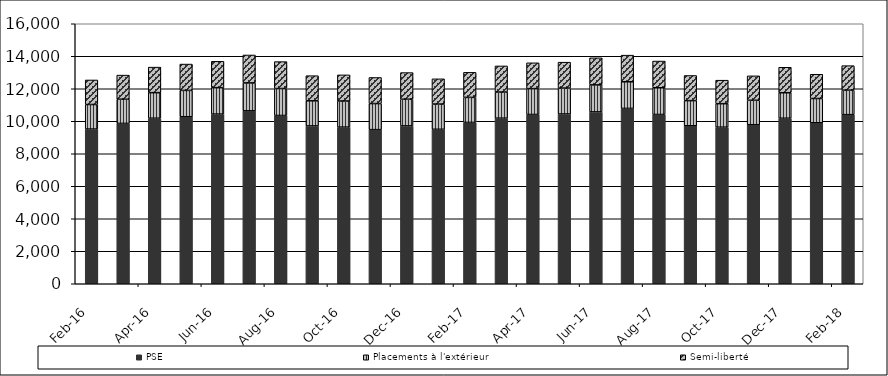
| Category | PSE | Placements à l'extérieur | Semi-liberté |
|---|---|---|---|
| 2016-02-01 | 9521 | 1510 | 1510 |
| 2016-03-01 | 9868 | 1486 | 1486 |
| 2016-04-01 | 10187 | 1572 | 1572 |
| 2016-05-01 | 10278 | 1621 | 1621 |
| 2016-06-01 | 10441 | 1625 | 1625 |
| 2016-07-01 | 10642 | 1718 | 1718 |
| 2016-08-01 | 10355 | 1658 | 1658 |
| 2016-09-01 | 9712 | 1546 | 1546 |
| 2016-10-01 | 9640 | 1607 | 1607 |
| 2016-11-01 | 9484 | 1605 | 1605 |
| 2016-12-01 | 9714 | 1641 | 1641 |
| 2017-01-01 | 9505 | 1553 | 1553 |
| 2017-02-01 | 9927 | 1542 | 1542 |
| 2017-03-01 | 10190 | 1607 | 1607 |
| 2017-04-01 | 10417 | 1590 | 1590 |
| 2017-05-01 | 10448 | 1594 | 1594 |
| 2017-06-01 | 10575 | 1664 | 1664 |
| 2017-07-01 | 10791 | 1639 | 1639 |
| 2017-08-01 | 10417 | 1644 | 1644 |
| 2017-09-01 | 9723 | 1547 | 1547 |
| 2017-10-01 | 9637 | 1445 | 1445 |
| 2017-11-01 | 9787 | 1504 | 1504 |
| 2017-12-01 | 10187 | 1568 | 1568 |
| 2018-01-01 | 9907 | 1493 | 1493 |
| 2018-02-01 | 10406 | 1508 | 1508 |